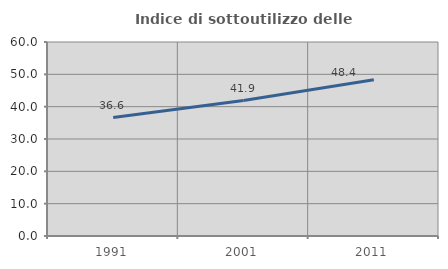
| Category | Indice di sottoutilizzo delle abitazioni  |
|---|---|
| 1991.0 | 36.639 |
| 2001.0 | 41.88 |
| 2011.0 | 48.353 |